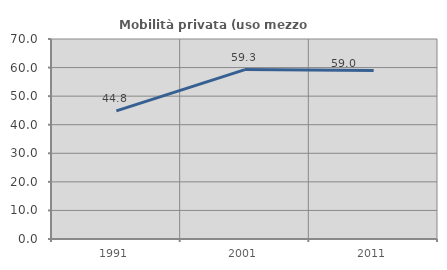
| Category | Mobilità privata (uso mezzo privato) |
|---|---|
| 1991.0 | 44.847 |
| 2001.0 | 59.292 |
| 2011.0 | 58.974 |